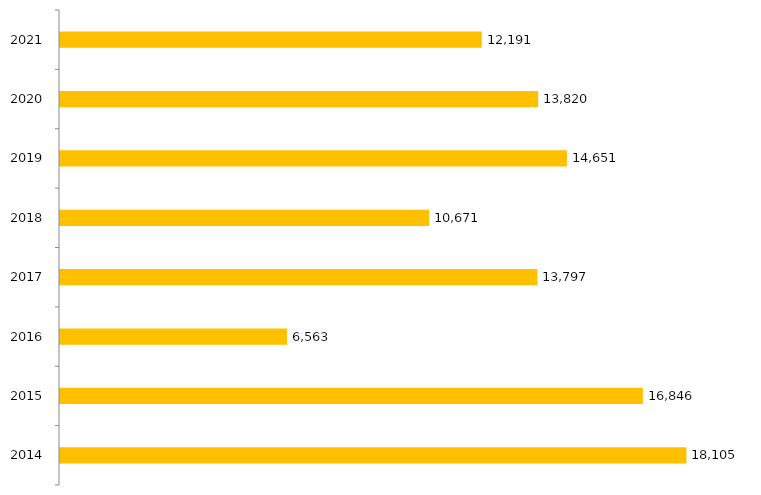
| Category | Inscritos |
|---|---|
| 2014.0 | 18105 |
| 2015.0 | 16846 |
| 2016.0 | 6563 |
| 2017.0 | 13797 |
| 2018.0 | 10671 |
| 2019.0 | 14651 |
| 2020.0 | 13820 |
| 2021.0 | 12191 |